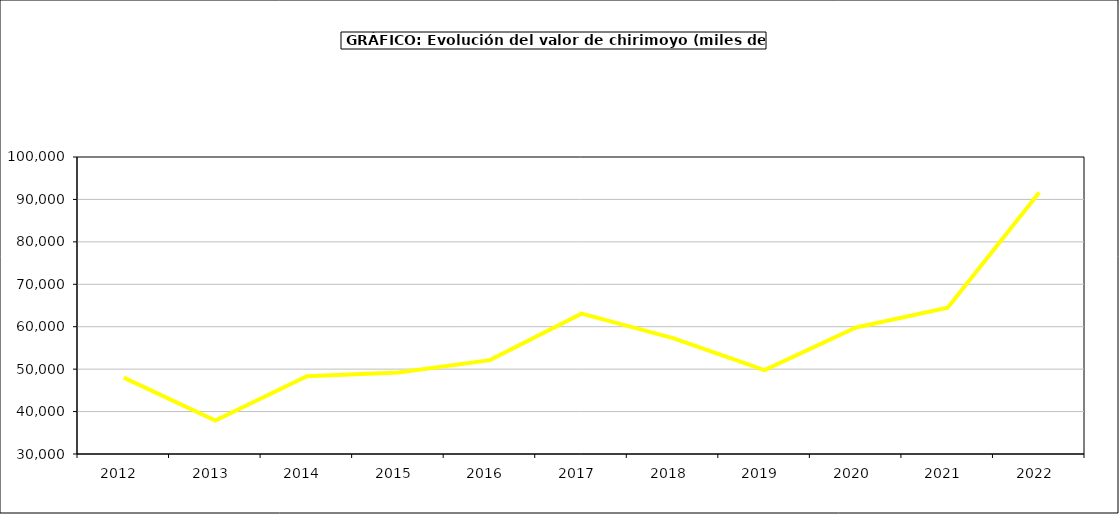
| Category | valor chirimoyo |
|---|---|
| 2012.0 | 47992.004 |
| 2013.0 | 37891.803 |
| 2014.0 | 48319.818 |
| 2015.0 | 49187 |
| 2016.0 | 52120 |
| 2017.0 | 63081.583 |
| 2018.0 | 57311.719 |
| 2019.0 | 49759.664 |
| 2020.0 | 59822.325 |
| 2021.0 | 64457.836 |
| 2022.0 | 91655.476 |